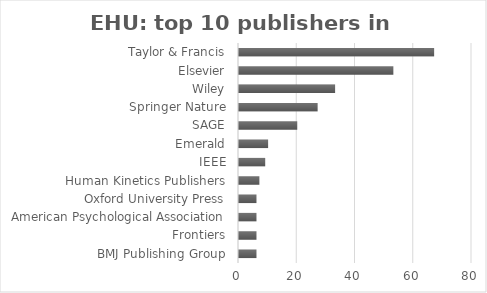
| Category | Series 0 |
|---|---|
| BMJ Publishing Group | 6 |
| Frontiers | 6 |
| American Psychological Association | 6 |
| Oxford University Press | 6 |
| Human Kinetics Publishers | 7 |
| IEEE | 9 |
| Emerald | 10 |
| SAGE | 20 |
| Springer Nature | 27 |
| Wiley | 33 |
| Elsevier | 53 |
| Taylor & Francis | 67 |